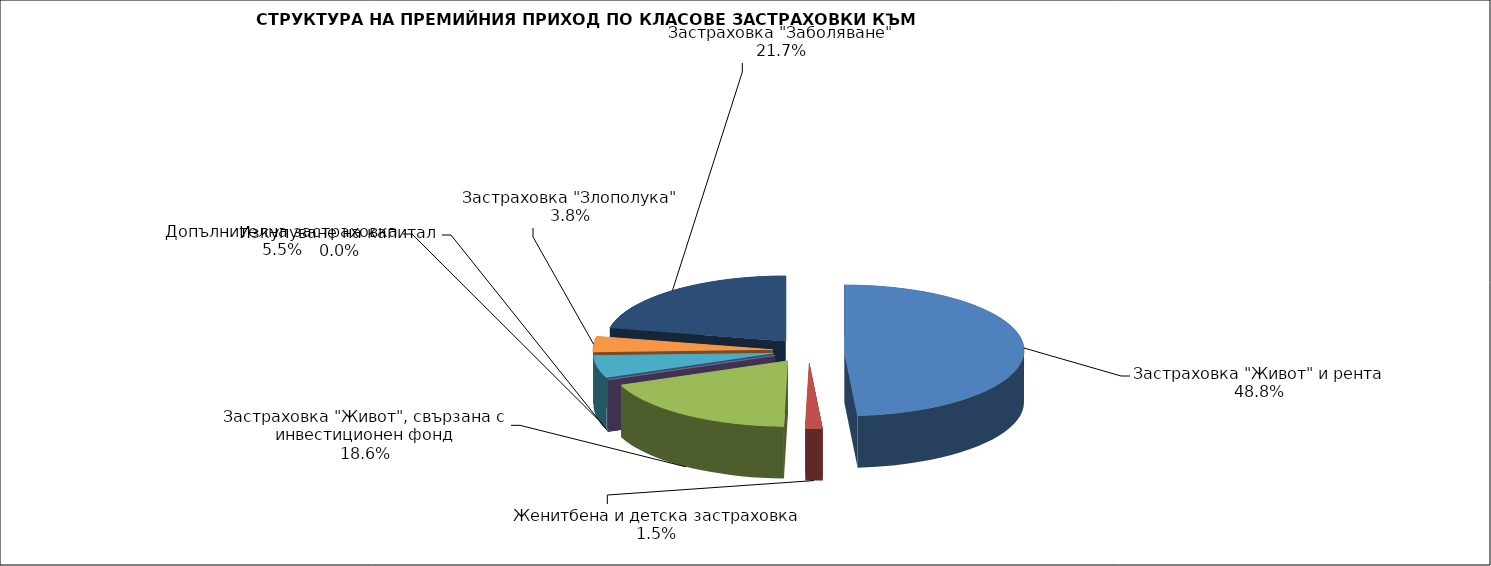
| Category | Series 0 |
|---|---|
| Застраховка "Живот" и рента | 201671274.31 |
| Женитбена и детска застраховка | 6348459.394 |
| Застраховка "Живот", свързана с инвестиционен фонд | 76751575.287 |
| Изкупуване на капитал | 0 |
| Допълнителна застраховка | 22686298.031 |
| Застраховка "Злополука" | 15858149.35 |
| Застраховка "Заболяване" | 89775988.75 |